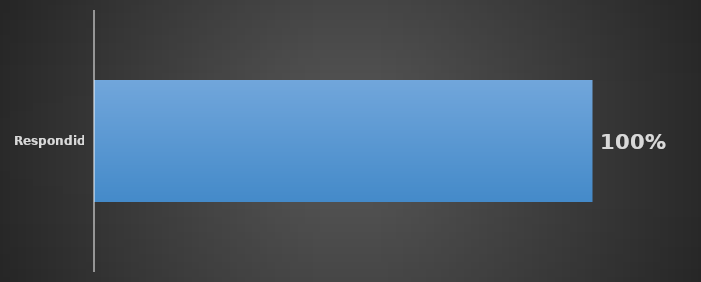
| Category | Total |
|---|---|
| Respondido | 1 |